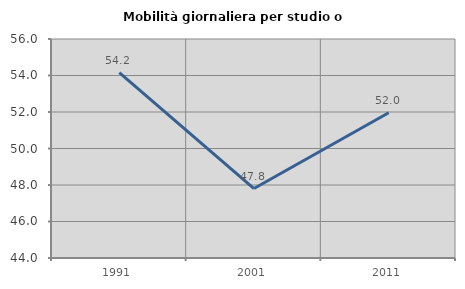
| Category | Mobilità giornaliera per studio o lavoro |
|---|---|
| 1991.0 | 54.158 |
| 2001.0 | 47.806 |
| 2011.0 | 51.961 |